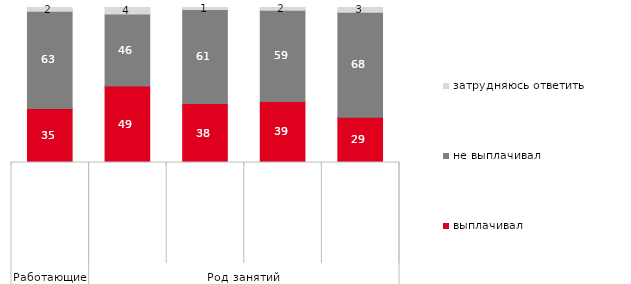
| Category | выплачивал | не выплачивал | затрудняюсь ответить |
|---|---|---|---|
| 0 | 34.766 | 62.751 | 2.483 |
| 1 | 49.296 | 46.479 | 4.225 |
| 2 | 38.047 | 60.606 | 1.347 |
| 3 | 39.412 | 58.824 | 1.765 |
| 4 | 29.273 | 67.583 | 3.143 |